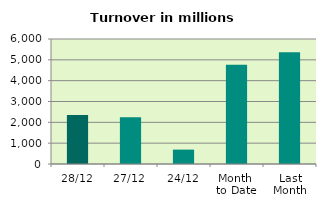
| Category | Series 0 |
|---|---|
| 28/12 | 2357.078 |
| 27/12 | 2243.242 |
| 24/12 | 690.082 |
| Month 
to Date | 4767.294 |
| Last
Month | 5362.851 |